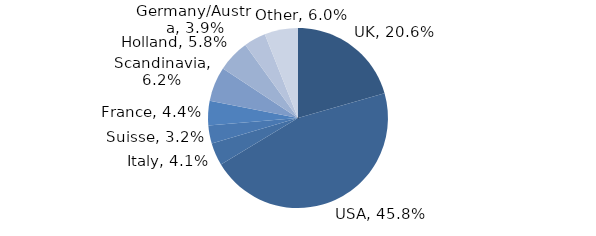
| Category | Investment Style |
|---|---|
| UK | 0.206 |
| USA | 0.458 |
| Italy | 0.041 |
| Suisse | 0.032 |
| France | 0.044 |
| Scandinavia | 0.062 |
| Holland | 0.058 |
| Germany/Austria | 0.039 |
| Other | 0.06 |